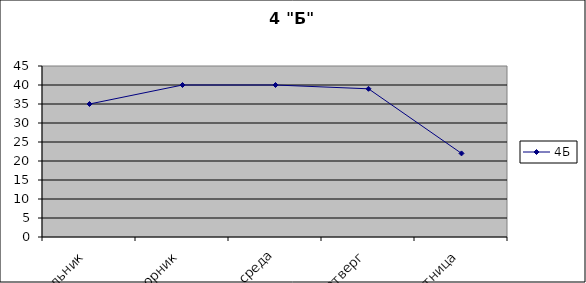
| Category | 4Б |
|---|---|
| понедельник | 35 |
| вторник | 40 |
| среда | 40 |
| четверг | 39 |
| пятница | 22 |